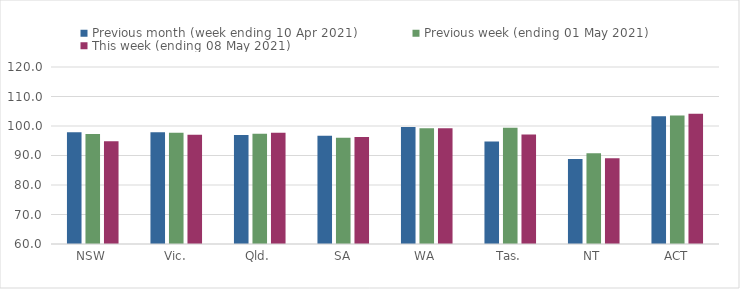
| Category | Previous month (week ending 10 Apr 2021) | Previous week (ending 01 May 2021) | This week (ending 08 May 2021) |
|---|---|---|---|
| NSW | 97.87 | 97.28 | 94.79 |
| Vic. | 97.92 | 97.73 | 97.06 |
| Qld. | 96.98 | 97.35 | 97.69 |
| SA | 96.69 | 96.05 | 96.29 |
| WA | 99.67 | 99.2 | 99.21 |
| Tas. | 94.71 | 99.4 | 97.16 |
| NT | 88.85 | 90.77 | 89.05 |
| ACT | 103.3 | 103.54 | 104.17 |